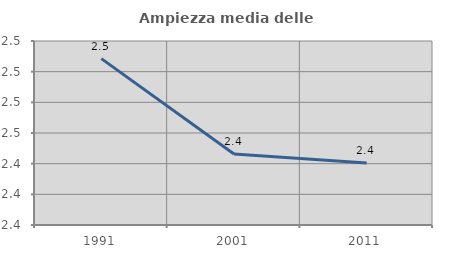
| Category | Ampiezza media delle famiglie |
|---|---|
| 1991.0 | 2.508 |
| 2001.0 | 2.446 |
| 2011.0 | 2.441 |